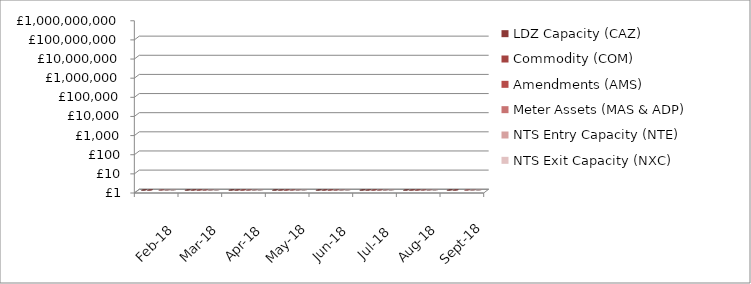
| Category | LDZ Capacity (CAZ) | Commodity (COM) | Amendments (AMS) | Meter Assets (MAS & ADP) | NTS Entry Capacity (NTE) | NTS Exit Capacity (NXC) |
|---|---|---|---|---|---|---|
| 2018-02-01 | 271243893.07 | 49577294.91 | -97584.69 | 175082.41 | 10887736.94 | 16944144.32 |
| 2018-03-01 | 300714752.62 | 47885458.16 | 435828.94 | 193565.33 | 12522228.64 | 16944144.32 |
| 2018-04-01 | 302200317.27 | 29034584.31 | 1543453.44 | 194233.3 | 1577511.57 | 18111359.22 |
| 2018-05-01 | 312174512.16 | 19449237 | 2024085.07 | 200707.08 | 1599795.55 | 18702620.75 |
| 2018-06-01 | 302299412.99 | 14591606.04 | 2213969.29 | 194233.54 | 1621553.61 | 18117525.2 |
| 2018-07-01 | 312562745.62 | 14290600.7 | 1483244.96 | 200707.69 | 1735803.71 | 18720256.49 |
| 2018-08-01 | 312780813.69 | 15048321.28 | 830443.17 | 200263.88 | 1735803.71 | 18720256.49 |
| 2018-09-01 | 302866760.19 | 17528307.3 | -385853.99 | 189788.22 | 1760935.51 | 18113875.74 |